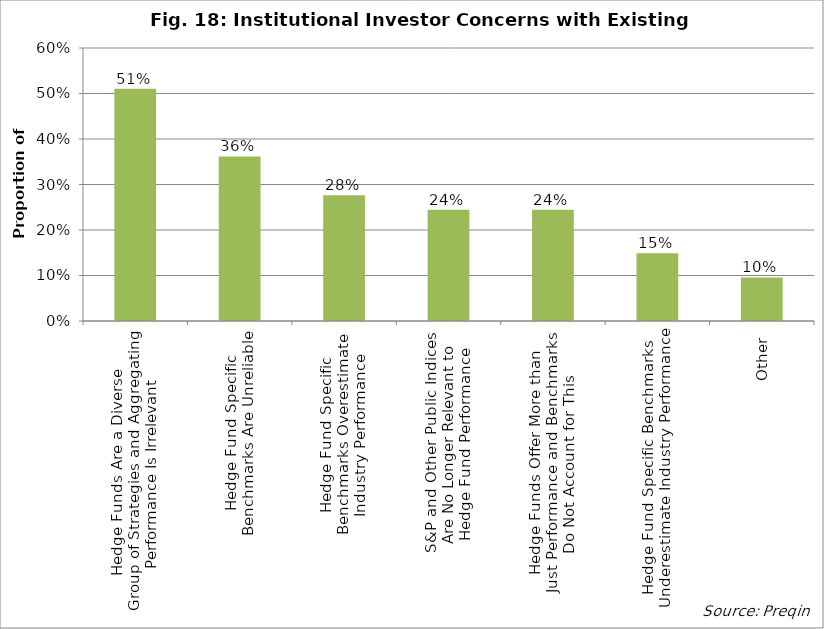
| Category | Proportion |
|---|---|
| Hedge Funds Are a Diverse
Group of Strategies and Aggregating
Performance Is Irrelevant | 0.511 |
| Hedge Fund Specific
Benchmarks Are Unreliable | 0.362 |
| Hedge Fund Specific
Benchmarks Overestimate
Industry Performance | 0.277 |
| S&P and Other Public Indices
Are No Longer Relevant to
Hedge Fund Performance | 0.245 |
| Hedge Funds Offer More than
Just Performance and Benchmarks
Do Not Account for This | 0.245 |
| Hedge Fund Specific Benchmarks
Underestimate Industry Performance | 0.149 |
| Other | 0.096 |